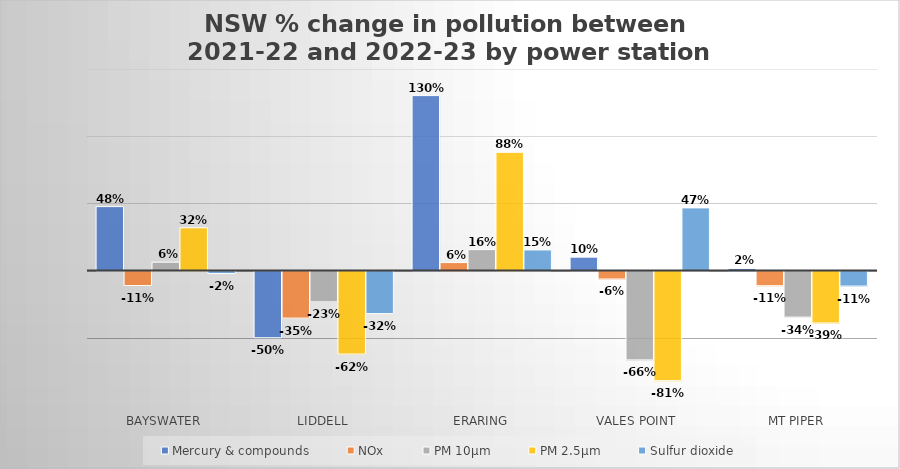
| Category | Mercury & compounds | NOx | PM 10μm | PM 2.5μm | Sulfur dioxide |
|---|---|---|---|---|---|
| Bayswater | 0.476 | -0.108 | 0.063 | 0.319 | -0.018 |
| Liddell | -0.496 | -0.35 | -0.229 | -0.617 | -0.316 |
|  Eraring  | 1.302 | 0.06 | 0.156 | 0.88 | 0.154 |
| Vales Point  | 0.1 | -0.059 | -0.661 | -0.815 | 0.467 |
| Mt Piper | 0.016 | -0.109 | -0.342 | -0.386 | -0.111 |